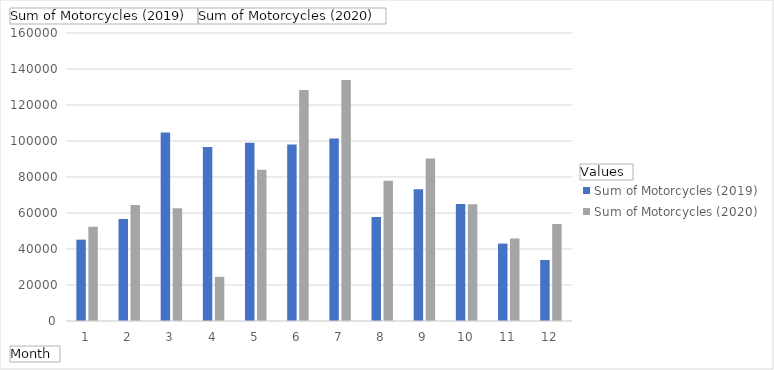
| Category | Sum of Motorcycles (2019) | Sum of Motorcycles (2020) |
|---|---|---|
| 1 | 45195 | 52295 |
| 2 | 56681 | 64396 |
| 3 | 104719 | 62656 |
| 4 | 96736 | 24536 |
| 5 | 98989 | 84054 |
| 6 | 98050 | 128392 |
| 7 | 101409 | 133926 |
| 8 | 57816 | 77867 |
| 9 | 73232 | 90336 |
| 10 | 65022 | 64880 |
| 11 | 43019 | 45854 |
| 12 | 33906 | 53910 |